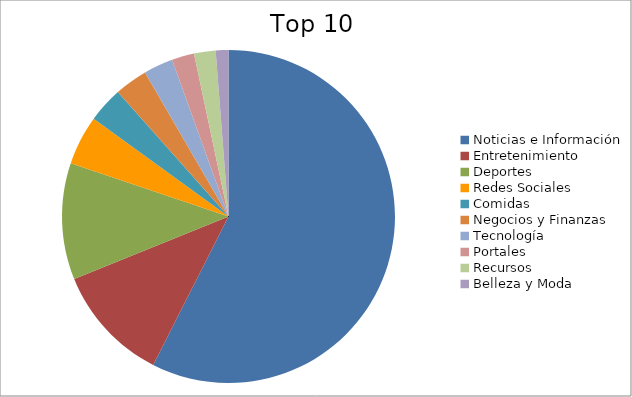
| Category | Series 0 |
|---|---|
| Noticias e Información | 55.14 |
| Entretenimiento | 10.93 |
| Deportes | 10.86 |
| Redes Sociales | 4.6 |
| Comidas | 3.31 |
| Negocios y Finanzas | 3.08 |
| Tecnología | 2.74 |
| Portales | 2.09 |
| Recursos | 2.01 |
| Belleza y Moda | 1.18 |